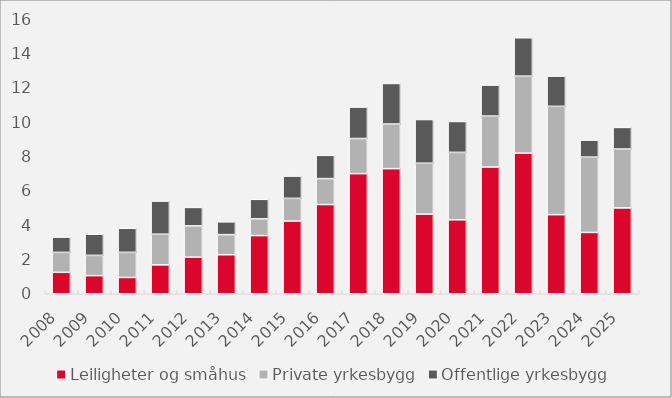
| Category | Leiligheter og småhus | Private yrkesbygg | Offentlige yrkesbygg |
|---|---|---|---|
| 2008.0 | 1.247 | 1.16 | 0.889 |
| 2009.0 | 1.054 | 1.179 | 1.228 |
| 2010.0 | 0.948 | 1.461 | 1.399 |
| 2011.0 | 1.681 | 1.785 | 1.927 |
| 2012.0 | 2.13 | 1.82 | 1.073 |
| 2013.0 | 2.27 | 1.17 | 0.744 |
| 2014.0 | 3.384 | 0.972 | 1.138 |
| 2015.0 | 4.231 | 1.319 | 1.298 |
| 2016.0 | 5.191 | 1.51 | 1.353 |
| 2017.0 | 6.989 | 2.043 | 1.828 |
| 2018.0 | 7.279 | 2.595 | 2.36 |
| 2019.0 | 4.633 | 2.961 | 2.542 |
| 2020.0 | 4.304 | 3.921 | 1.799 |
| 2021.0 | 7.375 | 2.961 | 1.805 |
| 2022.0 | 8.177 | 4.483 | 2.236 |
| 2023.0 | 4.602 | 6.301 | 1.76 |
| 2024.0 | 3.567 | 4.384 | 0.988 |
| 2025.0 | 4.995 | 3.426 | 1.257 |